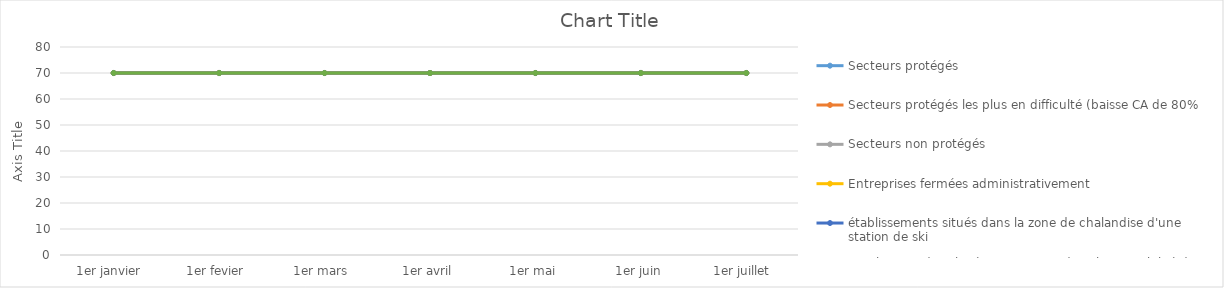
| Category | Secteurs protégés  | Secteurs protégés les plus en difficulté (baisse CA de 80% | Secteurs non protégés  | Entreprises fermées administrativement | établissements situés dans la zone de chalandise d'une station de ski | Employeurs de salariés se trouvant dans l'impossibilité de continuer à travailler (garde d'enfants et personnes vulnerables)  |
|---|---|---|---|---|---|---|
| 1er janvier  | 70 | 70 | 70 | 70 | 70 | 70 |
| 1er fevier  | 70 | 70 | 70 | 70 | 70 | 70 |
| 1er mars  | 70 | 70 | 70 | 70 | 70 | 70 |
| 1er avril | 70 | 70 | 70 | 70 | 70 | 70 |
| 1er mai | 70 | 70 | 70 | 70 | 70 | 70 |
| 1er juin | 70 | 70 | 70 | 70 | 70 | 70 |
| 1er juillet  | 70 | 70 | 70 | 70 | 70 | 70 |